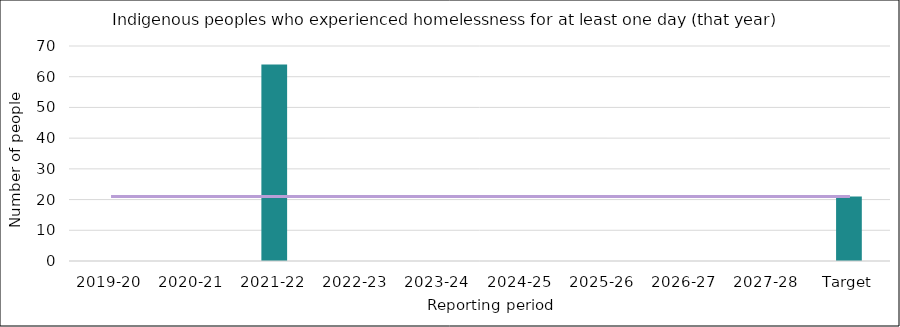
| Category | Series 0 |
|---|---|
| 2019-20 | 0 |
| 2020-21 | 0 |
| 2021-22 | 64 |
| 2022-23 | 0 |
| 2023-24 | 0 |
| 2024-25 | 0 |
| 2025-26 | 0 |
| 2026-27 | 0 |
| 2027-28 | 0 |
| Target | 21 |